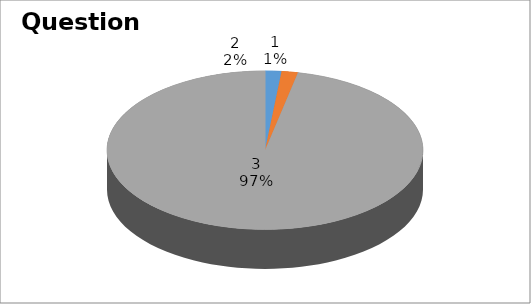
| Category | Series 0 |
|---|---|
| 0 | 1 |
| 1 | 1 |
| 2 | 58 |